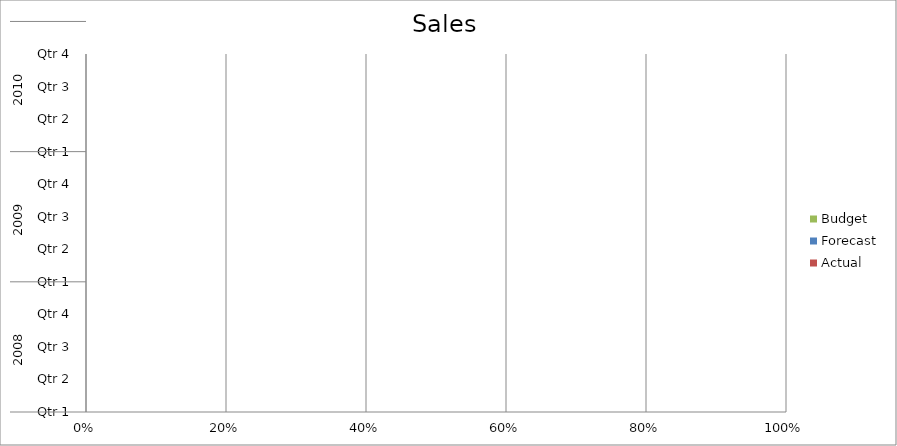
| Category | Budget | Forecast | Actual |
|---|---|---|---|
| 0 | 1470 | 2030 | 650 |
| 1 | 2660 | 2260 | 2950 |
| 2 | 2410 | 3090 | 2110 |
| 3 | 1350 | 3160 | 1890 |
| 4 | 530 | 1570 | 1110 |
| 5 | 2080 | 2510 | 1330 |
| 6 | 1920 | 3000 | 3060 |
| 7 | 3410 | 760 | 2020 |
| 8 | 2310 | 1910 | 2170 |
| 9 | 3170 | 1150 | 2490 |
| 10 | 2260 | 3390 | 1030 |
| 11 | 3210 | 1380 | 1250 |